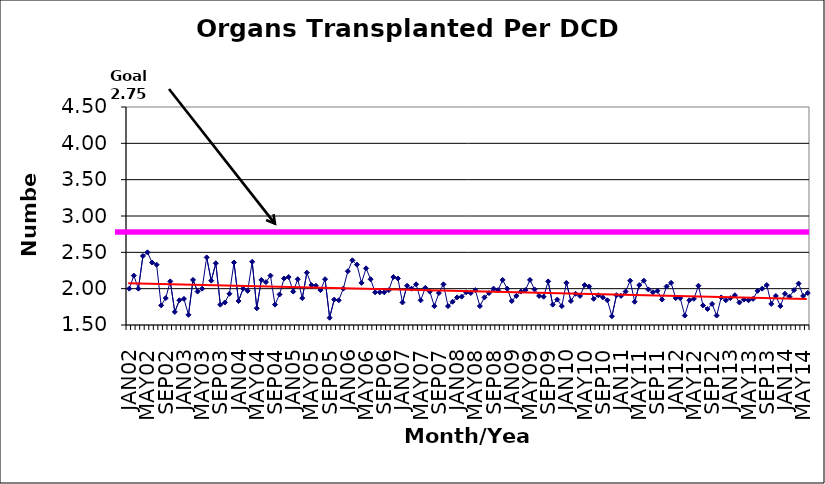
| Category | Series 0 |
|---|---|
| JAN02 | 2 |
| FEB02 | 2.18 |
| MAR02 | 2 |
| APR02 | 2.45 |
| MAY02 | 2.5 |
| JUN02 | 2.36 |
| JUL02 | 2.33 |
| AUG02 | 1.77 |
| SEP02 | 1.87 |
| OCT02 | 2.1 |
| NOV02 | 1.68 |
| DEC02 | 1.84 |
| JAN03 | 1.86 |
| FEB03 | 1.64 |
| MAR03 | 2.12 |
| APR03 | 1.96 |
| MAY03 | 2 |
| JUN03 | 2.43 |
| JUL03 | 2.11 |
| AUG03 | 2.35 |
| SEP03 | 1.78 |
| OCT03 | 1.81 |
| NOV03 | 1.93 |
| DEC03 | 2.36 |
| JAN04 | 1.83 |
| FEB04 | 2 |
| MAR04 | 1.97 |
| APR04 | 2.37 |
| MAY04 | 1.73 |
| JUN04 | 2.12 |
| JUL04 | 2.09 |
| AUG04 | 2.18 |
| SEP04 | 1.78 |
| OCT04 | 1.92 |
| NOV04 | 2.14 |
| DEC04 | 2.16 |
| JAN05 | 1.96 |
| FEB05 | 2.13 |
| MAR05 | 1.87 |
| APR05 | 2.22 |
| MAY05 | 2.05 |
| JUN05 | 2.04 |
| JUL05 | 1.98 |
| AUG05 | 2.13 |
| SEP05 | 1.6 |
| OCT05 | 1.85 |
| NOV05 | 1.84 |
| DEC05 | 2 |
| JAN06 | 2.24 |
| FEB06 | 2.39 |
| MAR06 | 2.33 |
| APR06 | 2.08 |
| MAY06 | 2.28 |
| JUN06 | 2.13 |
| JUL06 | 1.95 |
| AUG06 | 1.95 |
| SEP06 | 1.95 |
| OCT06 | 1.98 |
| NOV06 | 2.16 |
| DEC06 | 2.14 |
| JAN07 | 1.81 |
| FEB07 | 2.04 |
| MAR07 | 2 |
| APR07 | 2.06 |
| MAY07 | 1.84 |
| JUN07 | 2.01 |
| JUL07 | 1.96 |
| AUG07 | 1.76 |
| SEP07 | 1.94 |
| OCT07 | 2.06 |
| NOV07 | 1.76 |
| DEC07 | 1.82 |
| JAN08 | 1.88 |
| FEB08 | 1.89 |
| MAR08 | 1.95 |
| APR08 | 1.94 |
| MAY08 | 1.98 |
| JUN08 | 1.76 |
| JUL08 | 1.88 |
| AUG08 | 1.94 |
| SEP08 | 2 |
| OCT08 | 1.98 |
| NOV08 | 2.12 |
| DEC08 | 2 |
| JAN09 | 1.83 |
| FEB09 | 1.9 |
| MAR09 | 1.96 |
| APR09 | 1.98 |
| MAY09 | 2.12 |
| JUN09 | 1.99 |
| JUL09 | 1.9 |
| AUG09 | 1.89 |
| SEP09 | 2.1 |
| OCT09 | 1.78 |
| NOV09 | 1.85 |
| DEC09 | 1.76 |
| JAN10 | 2.08 |
| FEB10 | 1.83 |
| MAR10 | 1.93 |
| APR10 | 1.9 |
| MAY10 | 2.05 |
| JUN10 | 2.03 |
| JUL10 | 1.86 |
| AUG10 | 1.91 |
| SEP10 | 1.88 |
| OCT10 | 1.84 |
| NOV10 | 1.62 |
| DEC10 | 1.91 |
| JAN11 | 1.9 |
| FEB11 | 1.96 |
| MAR11 | 2.11 |
| APR11 | 1.82 |
| MAY11 | 2.05 |
| JUN11 | 2.11 |
| JUL11 | 1.99 |
| AUG11 | 1.95 |
| SEP11 | 1.97 |
| OCT11 | 1.85 |
| NOV11 | 2.03 |
| DEC11 | 2.08 |
| JAN12 | 1.87 |
| FEB12 | 1.87 |
| MAR12 | 1.63 |
| APR12 | 1.84 |
| MAY12 | 1.86 |
| JUN12 | 2.04 |
| JUL12 | 1.77 |
| AUG12 | 1.72 |
| SEP12 | 1.79 |
| OCT12 | 1.63 |
| NOV12 | 1.88 |
| DEC12 | 1.84 |
| JAN13 | 1.87 |
| FEB13 | 1.91 |
| MAR13 | 1.81 |
| APR13 | 1.85 |
| MAY13 | 1.84 |
| JUN13 | 1.86 |
| JUL13 | 1.97 |
| AUG13 | 2 |
| SEP13 | 2.05 |
| OCT13 | 1.79 |
| NOV13 | 1.9 |
| DEC13 | 1.76 |
| JAN14 | 1.93 |
| FEB14 | 1.89 |
| MAR14 | 1.98 |
| APR14 | 2.07 |
| MAY14 | 1.9 |
| JUN14 | 1.94 |